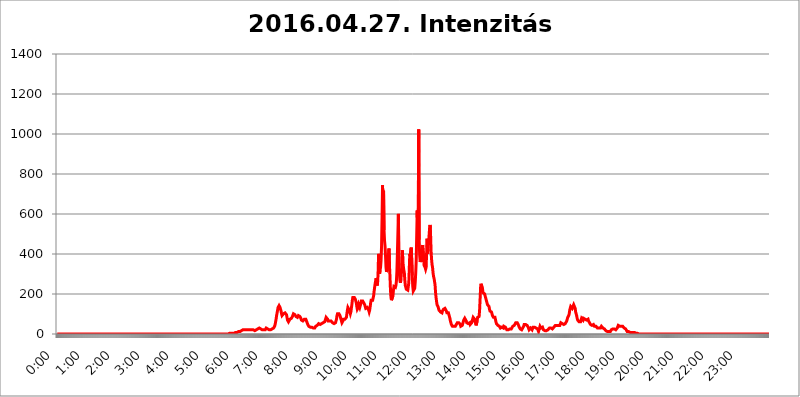
| Category | 2016.04.27. Intenzitás [W/m^2] |
|---|---|
| 0.0 | 0 |
| 0.0006944444444444445 | 0 |
| 0.001388888888888889 | 0 |
| 0.0020833333333333333 | 0 |
| 0.002777777777777778 | 0 |
| 0.003472222222222222 | 0 |
| 0.004166666666666667 | 0 |
| 0.004861111111111111 | 0 |
| 0.005555555555555556 | 0 |
| 0.0062499999999999995 | 0 |
| 0.006944444444444444 | 0 |
| 0.007638888888888889 | 0 |
| 0.008333333333333333 | 0 |
| 0.009027777777777779 | 0 |
| 0.009722222222222222 | 0 |
| 0.010416666666666666 | 0 |
| 0.011111111111111112 | 0 |
| 0.011805555555555555 | 0 |
| 0.012499999999999999 | 0 |
| 0.013194444444444444 | 0 |
| 0.013888888888888888 | 0 |
| 0.014583333333333332 | 0 |
| 0.015277777777777777 | 0 |
| 0.015972222222222224 | 0 |
| 0.016666666666666666 | 0 |
| 0.017361111111111112 | 0 |
| 0.018055555555555557 | 0 |
| 0.01875 | 0 |
| 0.019444444444444445 | 0 |
| 0.02013888888888889 | 0 |
| 0.020833333333333332 | 0 |
| 0.02152777777777778 | 0 |
| 0.022222222222222223 | 0 |
| 0.02291666666666667 | 0 |
| 0.02361111111111111 | 0 |
| 0.024305555555555556 | 0 |
| 0.024999999999999998 | 0 |
| 0.025694444444444447 | 0 |
| 0.02638888888888889 | 0 |
| 0.027083333333333334 | 0 |
| 0.027777777777777776 | 0 |
| 0.02847222222222222 | 0 |
| 0.029166666666666664 | 0 |
| 0.029861111111111113 | 0 |
| 0.030555555555555555 | 0 |
| 0.03125 | 0 |
| 0.03194444444444445 | 0 |
| 0.03263888888888889 | 0 |
| 0.03333333333333333 | 0 |
| 0.034027777777777775 | 0 |
| 0.034722222222222224 | 0 |
| 0.035416666666666666 | 0 |
| 0.036111111111111115 | 0 |
| 0.03680555555555556 | 0 |
| 0.0375 | 0 |
| 0.03819444444444444 | 0 |
| 0.03888888888888889 | 0 |
| 0.03958333333333333 | 0 |
| 0.04027777777777778 | 0 |
| 0.04097222222222222 | 0 |
| 0.041666666666666664 | 0 |
| 0.042361111111111106 | 0 |
| 0.04305555555555556 | 0 |
| 0.043750000000000004 | 0 |
| 0.044444444444444446 | 0 |
| 0.04513888888888889 | 0 |
| 0.04583333333333334 | 0 |
| 0.04652777777777778 | 0 |
| 0.04722222222222222 | 0 |
| 0.04791666666666666 | 0 |
| 0.04861111111111111 | 0 |
| 0.049305555555555554 | 0 |
| 0.049999999999999996 | 0 |
| 0.05069444444444445 | 0 |
| 0.051388888888888894 | 0 |
| 0.052083333333333336 | 0 |
| 0.05277777777777778 | 0 |
| 0.05347222222222222 | 0 |
| 0.05416666666666667 | 0 |
| 0.05486111111111111 | 0 |
| 0.05555555555555555 | 0 |
| 0.05625 | 0 |
| 0.05694444444444444 | 0 |
| 0.057638888888888885 | 0 |
| 0.05833333333333333 | 0 |
| 0.05902777777777778 | 0 |
| 0.059722222222222225 | 0 |
| 0.06041666666666667 | 0 |
| 0.061111111111111116 | 0 |
| 0.06180555555555556 | 0 |
| 0.0625 | 0 |
| 0.06319444444444444 | 0 |
| 0.06388888888888888 | 0 |
| 0.06458333333333334 | 0 |
| 0.06527777777777778 | 0 |
| 0.06597222222222222 | 0 |
| 0.06666666666666667 | 0 |
| 0.06736111111111111 | 0 |
| 0.06805555555555555 | 0 |
| 0.06874999999999999 | 0 |
| 0.06944444444444443 | 0 |
| 0.07013888888888889 | 0 |
| 0.07083333333333333 | 0 |
| 0.07152777777777779 | 0 |
| 0.07222222222222223 | 0 |
| 0.07291666666666667 | 0 |
| 0.07361111111111111 | 0 |
| 0.07430555555555556 | 0 |
| 0.075 | 0 |
| 0.07569444444444444 | 0 |
| 0.0763888888888889 | 0 |
| 0.07708333333333334 | 0 |
| 0.07777777777777778 | 0 |
| 0.07847222222222222 | 0 |
| 0.07916666666666666 | 0 |
| 0.0798611111111111 | 0 |
| 0.08055555555555556 | 0 |
| 0.08125 | 0 |
| 0.08194444444444444 | 0 |
| 0.08263888888888889 | 0 |
| 0.08333333333333333 | 0 |
| 0.08402777777777777 | 0 |
| 0.08472222222222221 | 0 |
| 0.08541666666666665 | 0 |
| 0.08611111111111112 | 0 |
| 0.08680555555555557 | 0 |
| 0.08750000000000001 | 0 |
| 0.08819444444444445 | 0 |
| 0.08888888888888889 | 0 |
| 0.08958333333333333 | 0 |
| 0.09027777777777778 | 0 |
| 0.09097222222222222 | 0 |
| 0.09166666666666667 | 0 |
| 0.09236111111111112 | 0 |
| 0.09305555555555556 | 0 |
| 0.09375 | 0 |
| 0.09444444444444444 | 0 |
| 0.09513888888888888 | 0 |
| 0.09583333333333333 | 0 |
| 0.09652777777777777 | 0 |
| 0.09722222222222222 | 0 |
| 0.09791666666666667 | 0 |
| 0.09861111111111111 | 0 |
| 0.09930555555555555 | 0 |
| 0.09999999999999999 | 0 |
| 0.10069444444444443 | 0 |
| 0.1013888888888889 | 0 |
| 0.10208333333333335 | 0 |
| 0.10277777777777779 | 0 |
| 0.10347222222222223 | 0 |
| 0.10416666666666667 | 0 |
| 0.10486111111111111 | 0 |
| 0.10555555555555556 | 0 |
| 0.10625 | 0 |
| 0.10694444444444444 | 0 |
| 0.1076388888888889 | 0 |
| 0.10833333333333334 | 0 |
| 0.10902777777777778 | 0 |
| 0.10972222222222222 | 0 |
| 0.1111111111111111 | 0 |
| 0.11180555555555556 | 0 |
| 0.11180555555555556 | 0 |
| 0.1125 | 0 |
| 0.11319444444444444 | 0 |
| 0.11388888888888889 | 0 |
| 0.11458333333333333 | 0 |
| 0.11527777777777777 | 0 |
| 0.11597222222222221 | 0 |
| 0.11666666666666665 | 0 |
| 0.1173611111111111 | 0 |
| 0.11805555555555557 | 0 |
| 0.11944444444444445 | 0 |
| 0.12013888888888889 | 0 |
| 0.12083333333333333 | 0 |
| 0.12152777777777778 | 0 |
| 0.12222222222222223 | 0 |
| 0.12291666666666667 | 0 |
| 0.12291666666666667 | 0 |
| 0.12361111111111112 | 0 |
| 0.12430555555555556 | 0 |
| 0.125 | 0 |
| 0.12569444444444444 | 0 |
| 0.12638888888888888 | 0 |
| 0.12708333333333333 | 0 |
| 0.16875 | 0 |
| 0.12847222222222224 | 0 |
| 0.12916666666666668 | 0 |
| 0.12986111111111112 | 0 |
| 0.13055555555555556 | 0 |
| 0.13125 | 0 |
| 0.13194444444444445 | 0 |
| 0.1326388888888889 | 0 |
| 0.13333333333333333 | 0 |
| 0.13402777777777777 | 0 |
| 0.13402777777777777 | 0 |
| 0.13472222222222222 | 0 |
| 0.13541666666666666 | 0 |
| 0.1361111111111111 | 0 |
| 0.13749999999999998 | 0 |
| 0.13819444444444443 | 0 |
| 0.1388888888888889 | 0 |
| 0.13958333333333334 | 0 |
| 0.14027777777777778 | 0 |
| 0.14097222222222222 | 0 |
| 0.14166666666666666 | 0 |
| 0.1423611111111111 | 0 |
| 0.14305555555555557 | 0 |
| 0.14375000000000002 | 0 |
| 0.14444444444444446 | 0 |
| 0.1451388888888889 | 0 |
| 0.1451388888888889 | 0 |
| 0.14652777777777778 | 0 |
| 0.14722222222222223 | 0 |
| 0.14791666666666667 | 0 |
| 0.1486111111111111 | 0 |
| 0.14930555555555555 | 0 |
| 0.15 | 0 |
| 0.15069444444444444 | 0 |
| 0.15138888888888888 | 0 |
| 0.15208333333333332 | 0 |
| 0.15277777777777776 | 0 |
| 0.15347222222222223 | 0 |
| 0.15416666666666667 | 0 |
| 0.15486111111111112 | 0 |
| 0.15555555555555556 | 0 |
| 0.15625 | 0 |
| 0.15694444444444444 | 0 |
| 0.15763888888888888 | 0 |
| 0.15833333333333333 | 0 |
| 0.15902777777777777 | 0 |
| 0.15972222222222224 | 0 |
| 0.16041666666666668 | 0 |
| 0.16111111111111112 | 0 |
| 0.16180555555555556 | 0 |
| 0.1625 | 0 |
| 0.16319444444444445 | 0 |
| 0.1638888888888889 | 0 |
| 0.16458333333333333 | 0 |
| 0.16527777777777777 | 0 |
| 0.16597222222222222 | 0 |
| 0.16666666666666666 | 0 |
| 0.1673611111111111 | 0 |
| 0.16805555555555554 | 0 |
| 0.16874999999999998 | 0 |
| 0.16944444444444443 | 0 |
| 0.17013888888888887 | 0 |
| 0.1708333333333333 | 0 |
| 0.17152777777777775 | 0 |
| 0.17222222222222225 | 0 |
| 0.1729166666666667 | 0 |
| 0.17361111111111113 | 0 |
| 0.17430555555555557 | 0 |
| 0.17500000000000002 | 0 |
| 0.17569444444444446 | 0 |
| 0.1763888888888889 | 0 |
| 0.17708333333333334 | 0 |
| 0.17777777777777778 | 0 |
| 0.17847222222222223 | 0 |
| 0.17916666666666667 | 0 |
| 0.1798611111111111 | 0 |
| 0.18055555555555555 | 0 |
| 0.18125 | 0 |
| 0.18194444444444444 | 0 |
| 0.1826388888888889 | 0 |
| 0.18333333333333335 | 0 |
| 0.1840277777777778 | 0 |
| 0.18472222222222223 | 0 |
| 0.18541666666666667 | 0 |
| 0.18611111111111112 | 0 |
| 0.18680555555555556 | 0 |
| 0.1875 | 0 |
| 0.18819444444444444 | 0 |
| 0.18888888888888888 | 0 |
| 0.18958333333333333 | 0 |
| 0.19027777777777777 | 0 |
| 0.1909722222222222 | 0 |
| 0.19166666666666665 | 0 |
| 0.19236111111111112 | 0 |
| 0.19305555555555554 | 0 |
| 0.19375 | 0 |
| 0.19444444444444445 | 0 |
| 0.1951388888888889 | 0 |
| 0.19583333333333333 | 0 |
| 0.19652777777777777 | 0 |
| 0.19722222222222222 | 0 |
| 0.19791666666666666 | 0 |
| 0.1986111111111111 | 0 |
| 0.19930555555555554 | 0 |
| 0.19999999999999998 | 0 |
| 0.20069444444444443 | 0 |
| 0.20138888888888887 | 0 |
| 0.2020833333333333 | 0 |
| 0.2027777777777778 | 0 |
| 0.2034722222222222 | 0 |
| 0.2041666666666667 | 0 |
| 0.20486111111111113 | 0 |
| 0.20555555555555557 | 0 |
| 0.20625000000000002 | 0 |
| 0.20694444444444446 | 0 |
| 0.2076388888888889 | 0 |
| 0.20833333333333334 | 0 |
| 0.20902777777777778 | 0 |
| 0.20972222222222223 | 0 |
| 0.21041666666666667 | 0 |
| 0.2111111111111111 | 0 |
| 0.21180555555555555 | 0 |
| 0.2125 | 0 |
| 0.21319444444444444 | 0 |
| 0.2138888888888889 | 0 |
| 0.21458333333333335 | 0 |
| 0.2152777777777778 | 0 |
| 0.21597222222222223 | 0 |
| 0.21666666666666667 | 0 |
| 0.21736111111111112 | 0 |
| 0.21805555555555556 | 0 |
| 0.21875 | 0 |
| 0.21944444444444444 | 0 |
| 0.22013888888888888 | 0 |
| 0.22083333333333333 | 0 |
| 0.22152777777777777 | 0 |
| 0.2222222222222222 | 0 |
| 0.22291666666666665 | 0 |
| 0.2236111111111111 | 0 |
| 0.22430555555555556 | 0 |
| 0.225 | 0 |
| 0.22569444444444445 | 0 |
| 0.2263888888888889 | 0 |
| 0.22708333333333333 | 0 |
| 0.22777777777777777 | 0 |
| 0.22847222222222222 | 0 |
| 0.22916666666666666 | 0 |
| 0.2298611111111111 | 0 |
| 0.23055555555555554 | 0 |
| 0.23124999999999998 | 0 |
| 0.23194444444444443 | 0 |
| 0.23263888888888887 | 0 |
| 0.2333333333333333 | 0 |
| 0.2340277777777778 | 0 |
| 0.2347222222222222 | 0 |
| 0.2354166666666667 | 0 |
| 0.23611111111111113 | 0 |
| 0.23680555555555557 | 0 |
| 0.23750000000000002 | 0 |
| 0.23819444444444446 | 0 |
| 0.2388888888888889 | 0 |
| 0.23958333333333334 | 0 |
| 0.24027777777777778 | 0 |
| 0.24097222222222223 | 0 |
| 0.24166666666666667 | 3.525 |
| 0.2423611111111111 | 3.525 |
| 0.24305555555555555 | 3.525 |
| 0.24375 | 3.525 |
| 0.24444444444444446 | 3.525 |
| 0.24513888888888888 | 3.525 |
| 0.24583333333333335 | 3.525 |
| 0.2465277777777778 | 3.525 |
| 0.24722222222222223 | 3.525 |
| 0.24791666666666667 | 3.525 |
| 0.24861111111111112 | 3.525 |
| 0.24930555555555556 | 7.887 |
| 0.25 | 7.887 |
| 0.25069444444444444 | 7.887 |
| 0.2513888888888889 | 7.887 |
| 0.2520833333333333 | 7.887 |
| 0.25277777777777777 | 7.887 |
| 0.2534722222222222 | 7.887 |
| 0.25416666666666665 | 12.257 |
| 0.2548611111111111 | 12.257 |
| 0.2555555555555556 | 12.257 |
| 0.25625000000000003 | 12.257 |
| 0.2569444444444445 | 12.257 |
| 0.2576388888888889 | 16.636 |
| 0.25833333333333336 | 16.636 |
| 0.2590277777777778 | 16.636 |
| 0.25972222222222224 | 21.024 |
| 0.2604166666666667 | 21.024 |
| 0.2611111111111111 | 21.024 |
| 0.26180555555555557 | 21.024 |
| 0.2625 | 21.024 |
| 0.26319444444444445 | 25.419 |
| 0.2638888888888889 | 21.024 |
| 0.26458333333333334 | 21.024 |
| 0.2652777777777778 | 21.024 |
| 0.2659722222222222 | 21.024 |
| 0.26666666666666666 | 21.024 |
| 0.2673611111111111 | 21.024 |
| 0.26805555555555555 | 21.024 |
| 0.26875 | 21.024 |
| 0.26944444444444443 | 21.024 |
| 0.2701388888888889 | 21.024 |
| 0.2708333333333333 | 21.024 |
| 0.27152777777777776 | 21.024 |
| 0.2722222222222222 | 21.024 |
| 0.27291666666666664 | 21.024 |
| 0.2736111111111111 | 21.024 |
| 0.2743055555555555 | 21.024 |
| 0.27499999999999997 | 21.024 |
| 0.27569444444444446 | 21.024 |
| 0.27638888888888885 | 21.024 |
| 0.27708333333333335 | 16.636 |
| 0.2777777777777778 | 21.024 |
| 0.27847222222222223 | 21.024 |
| 0.2791666666666667 | 21.024 |
| 0.2798611111111111 | 25.419 |
| 0.28055555555555556 | 25.419 |
| 0.28125 | 25.419 |
| 0.28194444444444444 | 29.823 |
| 0.2826388888888889 | 29.823 |
| 0.2833333333333333 | 29.823 |
| 0.28402777777777777 | 25.419 |
| 0.2847222222222222 | 25.419 |
| 0.28541666666666665 | 25.419 |
| 0.28611111111111115 | 25.419 |
| 0.28680555555555554 | 25.419 |
| 0.28750000000000003 | 21.024 |
| 0.2881944444444445 | 21.024 |
| 0.2888888888888889 | 21.024 |
| 0.28958333333333336 | 21.024 |
| 0.2902777777777778 | 21.024 |
| 0.29097222222222224 | 21.024 |
| 0.2916666666666667 | 21.024 |
| 0.2923611111111111 | 25.419 |
| 0.29305555555555557 | 29.823 |
| 0.29375 | 29.823 |
| 0.29444444444444445 | 25.419 |
| 0.2951388888888889 | 25.419 |
| 0.29583333333333334 | 25.419 |
| 0.2965277777777778 | 21.024 |
| 0.2972222222222222 | 21.024 |
| 0.29791666666666666 | 21.024 |
| 0.2986111111111111 | 21.024 |
| 0.29930555555555555 | 21.024 |
| 0.3 | 25.419 |
| 0.30069444444444443 | 25.419 |
| 0.3013888888888889 | 25.419 |
| 0.3020833333333333 | 25.419 |
| 0.30277777777777776 | 25.419 |
| 0.3034722222222222 | 29.823 |
| 0.30416666666666664 | 34.234 |
| 0.3048611111111111 | 38.653 |
| 0.3055555555555555 | 47.511 |
| 0.30624999999999997 | 60.85 |
| 0.3069444444444444 | 74.246 |
| 0.3076388888888889 | 92.184 |
| 0.30833333333333335 | 105.69 |
| 0.3090277777777778 | 119.235 |
| 0.30972222222222223 | 132.814 |
| 0.3104166666666667 | 137.347 |
| 0.3111111111111111 | 141.884 |
| 0.31180555555555556 | 137.347 |
| 0.3125 | 132.814 |
| 0.31319444444444444 | 123.758 |
| 0.3138888888888889 | 114.716 |
| 0.3145833333333333 | 101.184 |
| 0.31527777777777777 | 92.184 |
| 0.3159722222222222 | 92.184 |
| 0.31666666666666665 | 96.682 |
| 0.31736111111111115 | 101.184 |
| 0.31805555555555554 | 101.184 |
| 0.31875000000000003 | 101.184 |
| 0.3194444444444445 | 105.69 |
| 0.3201388888888889 | 110.201 |
| 0.32083333333333336 | 105.69 |
| 0.3215277777777778 | 96.682 |
| 0.32222222222222224 | 83.205 |
| 0.3229166666666667 | 69.775 |
| 0.3236111111111111 | 65.31 |
| 0.32430555555555557 | 60.85 |
| 0.325 | 60.85 |
| 0.32569444444444445 | 65.31 |
| 0.3263888888888889 | 74.246 |
| 0.32708333333333334 | 74.246 |
| 0.3277777777777778 | 78.722 |
| 0.3284722222222222 | 78.722 |
| 0.32916666666666666 | 83.205 |
| 0.3298611111111111 | 87.692 |
| 0.33055555555555555 | 92.184 |
| 0.33125 | 101.184 |
| 0.33194444444444443 | 105.69 |
| 0.3326388888888889 | 101.184 |
| 0.3333333333333333 | 96.682 |
| 0.3340277777777778 | 92.184 |
| 0.3347222222222222 | 87.692 |
| 0.3354166666666667 | 83.205 |
| 0.3361111111111111 | 83.205 |
| 0.3368055555555556 | 83.205 |
| 0.33749999999999997 | 87.692 |
| 0.33819444444444446 | 92.184 |
| 0.33888888888888885 | 92.184 |
| 0.33958333333333335 | 92.184 |
| 0.34027777777777773 | 87.692 |
| 0.34097222222222223 | 83.205 |
| 0.3416666666666666 | 78.722 |
| 0.3423611111111111 | 69.775 |
| 0.3430555555555555 | 65.31 |
| 0.34375 | 65.31 |
| 0.3444444444444445 | 65.31 |
| 0.3451388888888889 | 69.775 |
| 0.3458333333333334 | 69.775 |
| 0.34652777777777777 | 74.246 |
| 0.34722222222222227 | 74.246 |
| 0.34791666666666665 | 78.722 |
| 0.34861111111111115 | 74.246 |
| 0.34930555555555554 | 69.775 |
| 0.35000000000000003 | 60.85 |
| 0.3506944444444444 | 56.398 |
| 0.3513888888888889 | 47.511 |
| 0.3520833333333333 | 43.079 |
| 0.3527777777777778 | 38.653 |
| 0.3534722222222222 | 34.234 |
| 0.3541666666666667 | 34.234 |
| 0.3548611111111111 | 34.234 |
| 0.35555555555555557 | 34.234 |
| 0.35625 | 34.234 |
| 0.35694444444444445 | 34.234 |
| 0.3576388888888889 | 29.823 |
| 0.35833333333333334 | 29.823 |
| 0.3590277777777778 | 29.823 |
| 0.3597222222222222 | 29.823 |
| 0.36041666666666666 | 29.823 |
| 0.3611111111111111 | 29.823 |
| 0.36180555555555555 | 34.234 |
| 0.3625 | 38.653 |
| 0.36319444444444443 | 38.653 |
| 0.3638888888888889 | 43.079 |
| 0.3645833333333333 | 43.079 |
| 0.3652777777777778 | 43.079 |
| 0.3659722222222222 | 47.511 |
| 0.3666666666666667 | 51.951 |
| 0.3673611111111111 | 51.951 |
| 0.3680555555555556 | 47.511 |
| 0.36874999999999997 | 47.511 |
| 0.36944444444444446 | 47.511 |
| 0.37013888888888885 | 51.951 |
| 0.37083333333333335 | 51.951 |
| 0.37152777777777773 | 51.951 |
| 0.37222222222222223 | 51.951 |
| 0.3729166666666666 | 56.398 |
| 0.3736111111111111 | 56.398 |
| 0.3743055555555555 | 60.85 |
| 0.375 | 60.85 |
| 0.3756944444444445 | 65.31 |
| 0.3763888888888889 | 74.246 |
| 0.3770833333333334 | 83.205 |
| 0.37777777777777777 | 83.205 |
| 0.37847222222222227 | 78.722 |
| 0.37916666666666665 | 74.246 |
| 0.37986111111111115 | 65.31 |
| 0.38055555555555554 | 65.31 |
| 0.38125000000000003 | 65.31 |
| 0.3819444444444444 | 65.31 |
| 0.3826388888888889 | 65.31 |
| 0.3833333333333333 | 69.775 |
| 0.3840277777777778 | 65.31 |
| 0.3847222222222222 | 65.31 |
| 0.3854166666666667 | 60.85 |
| 0.3861111111111111 | 56.398 |
| 0.38680555555555557 | 51.951 |
| 0.3875 | 51.951 |
| 0.38819444444444445 | 51.951 |
| 0.3888888888888889 | 51.951 |
| 0.38958333333333334 | 56.398 |
| 0.3902777777777778 | 56.398 |
| 0.3909722222222222 | 60.85 |
| 0.39166666666666666 | 74.246 |
| 0.3923611111111111 | 92.184 |
| 0.39305555555555555 | 101.184 |
| 0.39375 | 105.69 |
| 0.39444444444444443 | 101.184 |
| 0.3951388888888889 | 101.184 |
| 0.3958333333333333 | 101.184 |
| 0.3965277777777778 | 92.184 |
| 0.3972222222222222 | 83.205 |
| 0.3979166666666667 | 78.722 |
| 0.3986111111111111 | 65.31 |
| 0.3993055555555556 | 56.398 |
| 0.39999999999999997 | 56.398 |
| 0.40069444444444446 | 65.31 |
| 0.40138888888888885 | 74.246 |
| 0.40208333333333335 | 74.246 |
| 0.40277777777777773 | 74.246 |
| 0.40347222222222223 | 74.246 |
| 0.4041666666666666 | 74.246 |
| 0.4048611111111111 | 74.246 |
| 0.4055555555555555 | 83.205 |
| 0.40625 | 101.184 |
| 0.4069444444444445 | 119.235 |
| 0.4076388888888889 | 132.814 |
| 0.4083333333333334 | 137.347 |
| 0.40902777777777777 | 128.284 |
| 0.40972222222222227 | 119.235 |
| 0.41041666666666665 | 110.201 |
| 0.41111111111111115 | 101.184 |
| 0.41180555555555554 | 110.201 |
| 0.41250000000000003 | 128.284 |
| 0.4131944444444444 | 146.423 |
| 0.4138888888888889 | 169.156 |
| 0.4145833333333333 | 182.82 |
| 0.4152777777777778 | 187.378 |
| 0.4159722222222222 | 187.378 |
| 0.4166666666666667 | 182.82 |
| 0.4173611111111111 | 178.264 |
| 0.41805555555555557 | 173.709 |
| 0.41875 | 173.709 |
| 0.41944444444444445 | 155.509 |
| 0.4201388888888889 | 137.347 |
| 0.42083333333333334 | 123.758 |
| 0.4215277777777778 | 123.758 |
| 0.4222222222222222 | 132.814 |
| 0.42291666666666666 | 146.423 |
| 0.4236111111111111 | 141.884 |
| 0.42430555555555555 | 132.814 |
| 0.425 | 137.347 |
| 0.42569444444444443 | 150.964 |
| 0.4263888888888889 | 164.605 |
| 0.4270833333333333 | 164.605 |
| 0.4277777777777778 | 169.156 |
| 0.4284722222222222 | 164.605 |
| 0.4291666666666667 | 160.056 |
| 0.4298611111111111 | 155.509 |
| 0.4305555555555556 | 150.964 |
| 0.43124999999999997 | 146.423 |
| 0.43194444444444446 | 137.347 |
| 0.43263888888888885 | 128.284 |
| 0.43333333333333335 | 123.758 |
| 0.43402777777777773 | 123.758 |
| 0.43472222222222223 | 132.814 |
| 0.4354166666666666 | 137.347 |
| 0.4361111111111111 | 128.284 |
| 0.4368055555555555 | 119.235 |
| 0.4375 | 110.201 |
| 0.4381944444444445 | 119.235 |
| 0.4388888888888889 | 137.347 |
| 0.4395833333333334 | 155.509 |
| 0.44027777777777777 | 169.156 |
| 0.44097222222222227 | 169.156 |
| 0.44166666666666665 | 164.605 |
| 0.44236111111111115 | 169.156 |
| 0.44305555555555554 | 173.709 |
| 0.44375000000000003 | 191.937 |
| 0.4444444444444444 | 214.746 |
| 0.4451388888888889 | 233 |
| 0.4458333333333333 | 251.251 |
| 0.4465277777777778 | 264.932 |
| 0.4472222222222222 | 278.603 |
| 0.4479166666666667 | 264.932 |
| 0.4486111111111111 | 242.127 |
| 0.44930555555555557 | 255.813 |
| 0.45 | 305.898 |
| 0.45069444444444445 | 400.638 |
| 0.4513888888888889 | 333.113 |
| 0.45208333333333334 | 301.354 |
| 0.4527777777777778 | 319.517 |
| 0.4534722222222222 | 333.113 |
| 0.45416666666666666 | 369.23 |
| 0.4548611111111111 | 440.702 |
| 0.45555555555555555 | 583.779 |
| 0.45625 | 743.859 |
| 0.45694444444444443 | 634.105 |
| 0.4576388888888889 | 715.858 |
| 0.4583333333333333 | 519.555 |
| 0.4590277777777778 | 467.187 |
| 0.4597222222222222 | 440.702 |
| 0.4604166666666667 | 391.685 |
| 0.4611111111111111 | 333.113 |
| 0.4618055555555556 | 310.44 |
| 0.46249999999999997 | 310.44 |
| 0.46319444444444446 | 324.052 |
| 0.46388888888888885 | 360.221 |
| 0.46458333333333335 | 396.164 |
| 0.46527777777777773 | 427.39 |
| 0.46597222222222223 | 342.162 |
| 0.4666666666666666 | 287.709 |
| 0.4673611111111111 | 219.309 |
| 0.4680555555555555 | 182.82 |
| 0.46875 | 169.156 |
| 0.4694444444444445 | 164.605 |
| 0.4701388888888889 | 173.709 |
| 0.4708333333333334 | 191.937 |
| 0.47152777777777777 | 219.309 |
| 0.47222222222222227 | 237.564 |
| 0.47291666666666665 | 242.127 |
| 0.47361111111111115 | 233 |
| 0.47430555555555554 | 233 |
| 0.47500000000000003 | 242.127 |
| 0.4756944444444444 | 264.932 |
| 0.4763888888888889 | 314.98 |
| 0.4770833333333333 | 405.108 |
| 0.4777777777777778 | 409.574 |
| 0.4784722222222222 | 600.661 |
| 0.4791666666666667 | 342.162 |
| 0.4798611111111111 | 301.354 |
| 0.48055555555555557 | 269.49 |
| 0.48125 | 255.813 |
| 0.48194444444444445 | 269.49 |
| 0.4826388888888889 | 301.354 |
| 0.48333333333333334 | 351.198 |
| 0.4840277777777778 | 418.492 |
| 0.4847222222222222 | 364.728 |
| 0.48541666666666666 | 337.639 |
| 0.4861111111111111 | 319.517 |
| 0.48680555555555555 | 305.898 |
| 0.4875 | 269.49 |
| 0.48819444444444443 | 242.127 |
| 0.4888888888888889 | 233 |
| 0.4895833333333333 | 223.873 |
| 0.4902777777777778 | 223.873 |
| 0.4909722222222222 | 219.309 |
| 0.4916666666666667 | 219.309 |
| 0.4923611111111111 | 223.873 |
| 0.4930555555555556 | 255.813 |
| 0.49374999999999997 | 328.584 |
| 0.49444444444444446 | 400.638 |
| 0.49513888888888885 | 391.685 |
| 0.49583333333333335 | 396.164 |
| 0.49652777777777773 | 431.833 |
| 0.49722222222222223 | 431.833 |
| 0.4979166666666666 | 292.259 |
| 0.4986111111111111 | 237.564 |
| 0.4993055555555555 | 214.746 |
| 0.5 | 210.182 |
| 0.5006944444444444 | 210.182 |
| 0.5013888888888889 | 228.436 |
| 0.5020833333333333 | 260.373 |
| 0.5027777777777778 | 305.898 |
| 0.5034722222222222 | 369.23 |
| 0.5041666666666667 | 493.475 |
| 0.5048611111111111 | 617.436 |
| 0.5055555555555555 | 515.223 |
| 0.50625 | 458.38 |
| 0.5069444444444444 | 1022.323 |
| 0.5076388888888889 | 471.582 |
| 0.5083333333333333 | 391.685 |
| 0.5090277777777777 | 360.221 |
| 0.5097222222222222 | 369.23 |
| 0.5104166666666666 | 360.221 |
| 0.5111111111111112 | 387.202 |
| 0.5118055555555555 | 422.943 |
| 0.5125000000000001 | 445.129 |
| 0.5131944444444444 | 440.702 |
| 0.513888888888889 | 378.224 |
| 0.5145833333333333 | 342.162 |
| 0.5152777777777778 | 337.639 |
| 0.5159722222222222 | 333.113 |
| 0.5166666666666667 | 324.052 |
| 0.517361111111111 | 333.113 |
| 0.5180555555555556 | 405.108 |
| 0.5187499999999999 | 475.972 |
| 0.5194444444444445 | 400.638 |
| 0.5201388888888888 | 427.39 |
| 0.5208333333333334 | 458.38 |
| 0.5215277777777778 | 493.475 |
| 0.5222222222222223 | 528.2 |
| 0.5229166666666667 | 545.416 |
| 0.5236111111111111 | 497.836 |
| 0.5243055555555556 | 414.035 |
| 0.525 | 373.729 |
| 0.5256944444444445 | 346.682 |
| 0.5263888888888889 | 333.113 |
| 0.5270833333333333 | 305.898 |
| 0.5277777777777778 | 287.709 |
| 0.5284722222222222 | 278.603 |
| 0.5291666666666667 | 274.047 |
| 0.5298611111111111 | 246.689 |
| 0.5305555555555556 | 210.182 |
| 0.53125 | 182.82 |
| 0.5319444444444444 | 164.605 |
| 0.5326388888888889 | 146.423 |
| 0.5333333333333333 | 141.884 |
| 0.5340277777777778 | 137.347 |
| 0.5347222222222222 | 128.284 |
| 0.5354166666666667 | 119.235 |
| 0.5361111111111111 | 119.235 |
| 0.5368055555555555 | 114.716 |
| 0.5375 | 110.201 |
| 0.5381944444444444 | 105.69 |
| 0.5388888888888889 | 105.69 |
| 0.5395833333333333 | 105.69 |
| 0.5402777777777777 | 114.716 |
| 0.5409722222222222 | 119.235 |
| 0.5416666666666666 | 123.758 |
| 0.5423611111111112 | 123.758 |
| 0.5430555555555555 | 123.758 |
| 0.5437500000000001 | 128.284 |
| 0.5444444444444444 | 132.814 |
| 0.545138888888889 | 128.284 |
| 0.5458333333333333 | 114.716 |
| 0.5465277777777778 | 105.69 |
| 0.5472222222222222 | 101.184 |
| 0.5479166666666667 | 105.69 |
| 0.548611111111111 | 105.69 |
| 0.5493055555555556 | 101.184 |
| 0.5499999999999999 | 87.692 |
| 0.5506944444444445 | 78.722 |
| 0.5513888888888888 | 65.31 |
| 0.5520833333333334 | 56.398 |
| 0.5527777777777778 | 47.511 |
| 0.5534722222222223 | 43.079 |
| 0.5541666666666667 | 38.653 |
| 0.5548611111111111 | 38.653 |
| 0.5555555555555556 | 38.653 |
| 0.55625 | 38.653 |
| 0.5569444444444445 | 38.653 |
| 0.5576388888888889 | 38.653 |
| 0.5583333333333333 | 38.653 |
| 0.5590277777777778 | 43.079 |
| 0.5597222222222222 | 47.511 |
| 0.5604166666666667 | 51.951 |
| 0.5611111111111111 | 56.398 |
| 0.5618055555555556 | 56.398 |
| 0.5625 | 56.398 |
| 0.5631944444444444 | 56.398 |
| 0.5638888888888889 | 56.398 |
| 0.5645833333333333 | 56.398 |
| 0.5652777777777778 | 47.511 |
| 0.5659722222222222 | 38.653 |
| 0.5666666666666667 | 38.653 |
| 0.5673611111111111 | 38.653 |
| 0.5680555555555555 | 43.079 |
| 0.56875 | 47.511 |
| 0.5694444444444444 | 60.85 |
| 0.5701388888888889 | 69.775 |
| 0.5708333333333333 | 69.775 |
| 0.5715277777777777 | 78.722 |
| 0.5722222222222222 | 78.722 |
| 0.5729166666666666 | 74.246 |
| 0.5736111111111112 | 65.31 |
| 0.5743055555555555 | 56.398 |
| 0.5750000000000001 | 51.951 |
| 0.5756944444444444 | 51.951 |
| 0.576388888888889 | 51.951 |
| 0.5770833333333333 | 51.951 |
| 0.5777777777777778 | 51.951 |
| 0.5784722222222222 | 56.398 |
| 0.5791666666666667 | 47.511 |
| 0.579861111111111 | 43.079 |
| 0.5805555555555556 | 51.951 |
| 0.5812499999999999 | 56.398 |
| 0.5819444444444445 | 65.31 |
| 0.5826388888888888 | 69.775 |
| 0.5833333333333334 | 83.205 |
| 0.5840277777777778 | 87.692 |
| 0.5847222222222223 | 83.205 |
| 0.5854166666666667 | 74.246 |
| 0.5861111111111111 | 60.85 |
| 0.5868055555555556 | 51.951 |
| 0.5875 | 43.079 |
| 0.5881944444444445 | 47.511 |
| 0.5888888888888889 | 65.31 |
| 0.5895833333333333 | 83.205 |
| 0.5902777777777778 | 87.692 |
| 0.5909722222222222 | 83.205 |
| 0.5916666666666667 | 87.692 |
| 0.5923611111111111 | 119.235 |
| 0.5930555555555556 | 173.709 |
| 0.59375 | 233 |
| 0.5944444444444444 | 251.251 |
| 0.5951388888888889 | 251.251 |
| 0.5958333333333333 | 246.689 |
| 0.5965277777777778 | 223.873 |
| 0.5972222222222222 | 205.62 |
| 0.5979166666666667 | 205.62 |
| 0.5986111111111111 | 210.182 |
| 0.5993055555555555 | 201.058 |
| 0.6 | 191.937 |
| 0.6006944444444444 | 182.82 |
| 0.6013888888888889 | 173.709 |
| 0.6020833333333333 | 164.605 |
| 0.6027777777777777 | 155.509 |
| 0.6034722222222222 | 146.423 |
| 0.6041666666666666 | 141.884 |
| 0.6048611111111112 | 141.884 |
| 0.6055555555555555 | 137.347 |
| 0.6062500000000001 | 123.758 |
| 0.6069444444444444 | 114.716 |
| 0.607638888888889 | 114.716 |
| 0.6083333333333333 | 114.716 |
| 0.6090277777777778 | 110.201 |
| 0.6097222222222222 | 101.184 |
| 0.6104166666666667 | 92.184 |
| 0.611111111111111 | 87.692 |
| 0.6118055555555556 | 83.205 |
| 0.6124999999999999 | 83.205 |
| 0.6131944444444445 | 83.205 |
| 0.6138888888888888 | 83.205 |
| 0.6145833333333334 | 78.722 |
| 0.6152777777777778 | 60.85 |
| 0.6159722222222223 | 51.951 |
| 0.6166666666666667 | 47.511 |
| 0.6173611111111111 | 47.511 |
| 0.6180555555555556 | 43.079 |
| 0.61875 | 43.079 |
| 0.6194444444444445 | 38.653 |
| 0.6201388888888889 | 38.653 |
| 0.6208333333333333 | 34.234 |
| 0.6215277777777778 | 29.823 |
| 0.6222222222222222 | 29.823 |
| 0.6229166666666667 | 29.823 |
| 0.6236111111111111 | 34.234 |
| 0.6243055555555556 | 34.234 |
| 0.625 | 29.823 |
| 0.6256944444444444 | 29.823 |
| 0.6263888888888889 | 38.653 |
| 0.6270833333333333 | 38.653 |
| 0.6277777777777778 | 38.653 |
| 0.6284722222222222 | 34.234 |
| 0.6291666666666667 | 34.234 |
| 0.6298611111111111 | 29.823 |
| 0.6305555555555555 | 21.024 |
| 0.63125 | 21.024 |
| 0.6319444444444444 | 21.024 |
| 0.6326388888888889 | 21.024 |
| 0.6333333333333333 | 25.419 |
| 0.6340277777777777 | 25.419 |
| 0.6347222222222222 | 25.419 |
| 0.6354166666666666 | 25.419 |
| 0.6361111111111112 | 25.419 |
| 0.6368055555555555 | 25.419 |
| 0.6375000000000001 | 29.823 |
| 0.6381944444444444 | 29.823 |
| 0.638888888888889 | 38.653 |
| 0.6395833333333333 | 43.079 |
| 0.6402777777777778 | 43.079 |
| 0.6409722222222222 | 43.079 |
| 0.6416666666666667 | 47.511 |
| 0.642361111111111 | 47.511 |
| 0.6430555555555556 | 56.398 |
| 0.6437499999999999 | 56.398 |
| 0.6444444444444445 | 56.398 |
| 0.6451388888888888 | 56.398 |
| 0.6458333333333334 | 51.951 |
| 0.6465277777777778 | 47.511 |
| 0.6472222222222223 | 43.079 |
| 0.6479166666666667 | 34.234 |
| 0.6486111111111111 | 29.823 |
| 0.6493055555555556 | 25.419 |
| 0.65 | 21.024 |
| 0.6506944444444445 | 21.024 |
| 0.6513888888888889 | 21.024 |
| 0.6520833333333333 | 25.419 |
| 0.6527777777777778 | 29.823 |
| 0.6534722222222222 | 34.234 |
| 0.6541666666666667 | 38.653 |
| 0.6548611111111111 | 47.511 |
| 0.6555555555555556 | 47.511 |
| 0.65625 | 47.511 |
| 0.6569444444444444 | 47.511 |
| 0.6576388888888889 | 47.511 |
| 0.6583333333333333 | 43.079 |
| 0.6590277777777778 | 43.079 |
| 0.6597222222222222 | 38.653 |
| 0.6604166666666667 | 34.234 |
| 0.6611111111111111 | 29.823 |
| 0.6618055555555555 | 21.024 |
| 0.6625 | 21.024 |
| 0.6631944444444444 | 25.419 |
| 0.6638888888888889 | 29.823 |
| 0.6645833333333333 | 29.823 |
| 0.6652777777777777 | 29.823 |
| 0.6659722222222222 | 21.024 |
| 0.6666666666666666 | 25.419 |
| 0.6673611111111111 | 34.234 |
| 0.6680555555555556 | 38.653 |
| 0.6687500000000001 | 34.234 |
| 0.6694444444444444 | 34.234 |
| 0.6701388888888888 | 34.234 |
| 0.6708333333333334 | 34.234 |
| 0.6715277777777778 | 29.823 |
| 0.6722222222222222 | 25.419 |
| 0.6729166666666666 | 29.823 |
| 0.6736111111111112 | 25.419 |
| 0.6743055555555556 | 21.024 |
| 0.6749999999999999 | 12.257 |
| 0.6756944444444444 | 21.024 |
| 0.6763888888888889 | 29.823 |
| 0.6770833333333334 | 38.653 |
| 0.6777777777777777 | 38.653 |
| 0.6784722222222223 | 29.823 |
| 0.6791666666666667 | 29.823 |
| 0.6798611111111111 | 29.823 |
| 0.6805555555555555 | 34.234 |
| 0.68125 | 29.823 |
| 0.6819444444444445 | 21.024 |
| 0.6826388888888889 | 21.024 |
| 0.6833333333333332 | 16.636 |
| 0.6840277777777778 | 16.636 |
| 0.6847222222222222 | 16.636 |
| 0.6854166666666667 | 16.636 |
| 0.686111111111111 | 16.636 |
| 0.6868055555555556 | 16.636 |
| 0.6875 | 16.636 |
| 0.6881944444444444 | 21.024 |
| 0.688888888888889 | 25.419 |
| 0.6895833333333333 | 25.419 |
| 0.6902777777777778 | 29.823 |
| 0.6909722222222222 | 29.823 |
| 0.6916666666666668 | 29.823 |
| 0.6923611111111111 | 29.823 |
| 0.6930555555555555 | 29.823 |
| 0.69375 | 25.419 |
| 0.6944444444444445 | 25.419 |
| 0.6951388888888889 | 25.419 |
| 0.6958333333333333 | 29.823 |
| 0.6965277777777777 | 34.234 |
| 0.6972222222222223 | 38.653 |
| 0.6979166666666666 | 38.653 |
| 0.6986111111111111 | 43.079 |
| 0.6993055555555556 | 47.511 |
| 0.7000000000000001 | 43.079 |
| 0.7006944444444444 | 43.079 |
| 0.7013888888888888 | 38.653 |
| 0.7020833333333334 | 43.079 |
| 0.7027777777777778 | 43.079 |
| 0.7034722222222222 | 38.653 |
| 0.7041666666666666 | 38.653 |
| 0.7048611111111112 | 43.079 |
| 0.7055555555555556 | 47.511 |
| 0.7062499999999999 | 56.398 |
| 0.7069444444444444 | 56.398 |
| 0.7076388888888889 | 56.398 |
| 0.7083333333333334 | 51.951 |
| 0.7090277777777777 | 47.511 |
| 0.7097222222222223 | 47.511 |
| 0.7104166666666667 | 47.511 |
| 0.7111111111111111 | 51.951 |
| 0.7118055555555555 | 51.951 |
| 0.7125 | 51.951 |
| 0.7131944444444445 | 51.951 |
| 0.7138888888888889 | 56.398 |
| 0.7145833333333332 | 65.31 |
| 0.7152777777777778 | 74.246 |
| 0.7159722222222222 | 83.205 |
| 0.7166666666666667 | 83.205 |
| 0.717361111111111 | 92.184 |
| 0.7180555555555556 | 101.184 |
| 0.71875 | 119.235 |
| 0.7194444444444444 | 128.284 |
| 0.720138888888889 | 137.347 |
| 0.7208333333333333 | 137.347 |
| 0.7215277777777778 | 132.814 |
| 0.7222222222222222 | 128.284 |
| 0.7229166666666668 | 123.758 |
| 0.7236111111111111 | 128.284 |
| 0.7243055555555555 | 146.423 |
| 0.725 | 150.964 |
| 0.7256944444444445 | 141.884 |
| 0.7263888888888889 | 128.284 |
| 0.7270833333333333 | 110.201 |
| 0.7277777777777777 | 101.184 |
| 0.7284722222222223 | 92.184 |
| 0.7291666666666666 | 78.722 |
| 0.7298611111111111 | 69.775 |
| 0.7305555555555556 | 65.31 |
| 0.7312500000000001 | 65.31 |
| 0.7319444444444444 | 60.85 |
| 0.7326388888888888 | 56.398 |
| 0.7333333333333334 | 56.398 |
| 0.7340277777777778 | 60.85 |
| 0.7347222222222222 | 65.31 |
| 0.7354166666666666 | 78.722 |
| 0.7361111111111112 | 78.722 |
| 0.7368055555555556 | 74.246 |
| 0.7374999999999999 | 69.775 |
| 0.7381944444444444 | 78.722 |
| 0.7388888888888889 | 83.205 |
| 0.7395833333333334 | 74.246 |
| 0.7402777777777777 | 74.246 |
| 0.7409722222222223 | 69.775 |
| 0.7416666666666667 | 69.775 |
| 0.7423611111111111 | 69.775 |
| 0.7430555555555555 | 74.246 |
| 0.74375 | 74.246 |
| 0.7444444444444445 | 74.246 |
| 0.7451388888888889 | 65.31 |
| 0.7458333333333332 | 65.31 |
| 0.7465277777777778 | 56.398 |
| 0.7472222222222222 | 51.951 |
| 0.7479166666666667 | 47.511 |
| 0.748611111111111 | 47.511 |
| 0.7493055555555556 | 43.079 |
| 0.75 | 43.079 |
| 0.7506944444444444 | 43.079 |
| 0.751388888888889 | 43.079 |
| 0.7520833333333333 | 47.511 |
| 0.7527777777777778 | 43.079 |
| 0.7534722222222222 | 38.653 |
| 0.7541666666666668 | 38.653 |
| 0.7548611111111111 | 38.653 |
| 0.7555555555555555 | 38.653 |
| 0.75625 | 38.653 |
| 0.7569444444444445 | 34.234 |
| 0.7576388888888889 | 29.823 |
| 0.7583333333333333 | 34.234 |
| 0.7590277777777777 | 34.234 |
| 0.7597222222222223 | 29.823 |
| 0.7604166666666666 | 29.823 |
| 0.7611111111111111 | 29.823 |
| 0.7618055555555556 | 29.823 |
| 0.7625000000000001 | 34.234 |
| 0.7631944444444444 | 38.653 |
| 0.7638888888888888 | 38.653 |
| 0.7645833333333334 | 34.234 |
| 0.7652777777777778 | 29.823 |
| 0.7659722222222222 | 25.419 |
| 0.7666666666666666 | 25.419 |
| 0.7673611111111112 | 25.419 |
| 0.7680555555555556 | 21.024 |
| 0.7687499999999999 | 21.024 |
| 0.7694444444444444 | 16.636 |
| 0.7701388888888889 | 12.257 |
| 0.7708333333333334 | 12.257 |
| 0.7715277777777777 | 12.257 |
| 0.7722222222222223 | 12.257 |
| 0.7729166666666667 | 12.257 |
| 0.7736111111111111 | 12.257 |
| 0.7743055555555555 | 16.636 |
| 0.775 | 16.636 |
| 0.7756944444444445 | 12.257 |
| 0.7763888888888889 | 16.636 |
| 0.7770833333333332 | 21.024 |
| 0.7777777777777778 | 21.024 |
| 0.7784722222222222 | 21.024 |
| 0.7791666666666667 | 25.419 |
| 0.779861111111111 | 29.823 |
| 0.7805555555555556 | 29.823 |
| 0.78125 | 25.419 |
| 0.7819444444444444 | 21.024 |
| 0.782638888888889 | 25.419 |
| 0.7833333333333333 | 21.024 |
| 0.7840277777777778 | 21.024 |
| 0.7847222222222222 | 21.024 |
| 0.7854166666666668 | 29.823 |
| 0.7861111111111111 | 34.234 |
| 0.7868055555555555 | 43.079 |
| 0.7875 | 47.511 |
| 0.7881944444444445 | 38.653 |
| 0.7888888888888889 | 38.653 |
| 0.7895833333333333 | 34.234 |
| 0.7902777777777777 | 38.653 |
| 0.7909722222222223 | 38.653 |
| 0.7916666666666666 | 34.234 |
| 0.7923611111111111 | 34.234 |
| 0.7930555555555556 | 38.653 |
| 0.7937500000000001 | 38.653 |
| 0.7944444444444444 | 34.234 |
| 0.7951388888888888 | 29.823 |
| 0.7958333333333334 | 29.823 |
| 0.7965277777777778 | 25.419 |
| 0.7972222222222222 | 25.419 |
| 0.7979166666666666 | 21.024 |
| 0.7986111111111112 | 21.024 |
| 0.7993055555555556 | 12.257 |
| 0.7999999999999999 | 12.257 |
| 0.8006944444444444 | 12.257 |
| 0.8013888888888889 | 12.257 |
| 0.8020833333333334 | 7.887 |
| 0.8027777777777777 | 12.257 |
| 0.8034722222222223 | 7.887 |
| 0.8041666666666667 | 7.887 |
| 0.8048611111111111 | 7.887 |
| 0.8055555555555555 | 7.887 |
| 0.80625 | 7.887 |
| 0.8069444444444445 | 7.887 |
| 0.8076388888888889 | 7.887 |
| 0.8083333333333332 | 7.887 |
| 0.8090277777777778 | 7.887 |
| 0.8097222222222222 | 7.887 |
| 0.8104166666666667 | 7.887 |
| 0.811111111111111 | 3.525 |
| 0.8118055555555556 | 3.525 |
| 0.8125 | 3.525 |
| 0.8131944444444444 | 3.525 |
| 0.813888888888889 | 3.525 |
| 0.8145833333333333 | 3.525 |
| 0.8152777777777778 | 0 |
| 0.8159722222222222 | 0 |
| 0.8166666666666668 | 0 |
| 0.8173611111111111 | 0 |
| 0.8180555555555555 | 0 |
| 0.81875 | 0 |
| 0.8194444444444445 | 0 |
| 0.8201388888888889 | 0 |
| 0.8208333333333333 | 0 |
| 0.8215277777777777 | 0 |
| 0.8222222222222223 | 0 |
| 0.8229166666666666 | 0 |
| 0.8236111111111111 | 0 |
| 0.8243055555555556 | 0 |
| 0.8250000000000001 | 0 |
| 0.8256944444444444 | 0 |
| 0.8263888888888888 | 0 |
| 0.8270833333333334 | 0 |
| 0.8277777777777778 | 0 |
| 0.8284722222222222 | 0 |
| 0.8291666666666666 | 0 |
| 0.8298611111111112 | 0 |
| 0.8305555555555556 | 0 |
| 0.8312499999999999 | 0 |
| 0.8319444444444444 | 0 |
| 0.8326388888888889 | 0 |
| 0.8333333333333334 | 0 |
| 0.8340277777777777 | 0 |
| 0.8347222222222223 | 0 |
| 0.8354166666666667 | 0 |
| 0.8361111111111111 | 0 |
| 0.8368055555555555 | 0 |
| 0.8375 | 0 |
| 0.8381944444444445 | 0 |
| 0.8388888888888889 | 0 |
| 0.8395833333333332 | 0 |
| 0.8402777777777778 | 0 |
| 0.8409722222222222 | 0 |
| 0.8416666666666667 | 0 |
| 0.842361111111111 | 0 |
| 0.8430555555555556 | 0 |
| 0.84375 | 0 |
| 0.8444444444444444 | 0 |
| 0.845138888888889 | 0 |
| 0.8458333333333333 | 0 |
| 0.8465277777777778 | 0 |
| 0.8472222222222222 | 0 |
| 0.8479166666666668 | 0 |
| 0.8486111111111111 | 0 |
| 0.8493055555555555 | 0 |
| 0.85 | 0 |
| 0.8506944444444445 | 0 |
| 0.8513888888888889 | 0 |
| 0.8520833333333333 | 0 |
| 0.8527777777777777 | 0 |
| 0.8534722222222223 | 0 |
| 0.8541666666666666 | 0 |
| 0.8548611111111111 | 0 |
| 0.8555555555555556 | 0 |
| 0.8562500000000001 | 0 |
| 0.8569444444444444 | 0 |
| 0.8576388888888888 | 0 |
| 0.8583333333333334 | 0 |
| 0.8590277777777778 | 0 |
| 0.8597222222222222 | 0 |
| 0.8604166666666666 | 0 |
| 0.8611111111111112 | 0 |
| 0.8618055555555556 | 0 |
| 0.8624999999999999 | 0 |
| 0.8631944444444444 | 0 |
| 0.8638888888888889 | 0 |
| 0.8645833333333334 | 0 |
| 0.8652777777777777 | 0 |
| 0.8659722222222223 | 0 |
| 0.8666666666666667 | 0 |
| 0.8673611111111111 | 0 |
| 0.8680555555555555 | 0 |
| 0.86875 | 0 |
| 0.8694444444444445 | 0 |
| 0.8701388888888889 | 0 |
| 0.8708333333333332 | 0 |
| 0.8715277777777778 | 0 |
| 0.8722222222222222 | 0 |
| 0.8729166666666667 | 0 |
| 0.873611111111111 | 0 |
| 0.8743055555555556 | 0 |
| 0.875 | 0 |
| 0.8756944444444444 | 0 |
| 0.876388888888889 | 0 |
| 0.8770833333333333 | 0 |
| 0.8777777777777778 | 0 |
| 0.8784722222222222 | 0 |
| 0.8791666666666668 | 0 |
| 0.8798611111111111 | 0 |
| 0.8805555555555555 | 0 |
| 0.88125 | 0 |
| 0.8819444444444445 | 0 |
| 0.8826388888888889 | 0 |
| 0.8833333333333333 | 0 |
| 0.8840277777777777 | 0 |
| 0.8847222222222223 | 0 |
| 0.8854166666666666 | 0 |
| 0.8861111111111111 | 0 |
| 0.8868055555555556 | 0 |
| 0.8875000000000001 | 0 |
| 0.8881944444444444 | 0 |
| 0.8888888888888888 | 0 |
| 0.8895833333333334 | 0 |
| 0.8902777777777778 | 0 |
| 0.8909722222222222 | 0 |
| 0.8916666666666666 | 0 |
| 0.8923611111111112 | 0 |
| 0.8930555555555556 | 0 |
| 0.8937499999999999 | 0 |
| 0.8944444444444444 | 0 |
| 0.8951388888888889 | 0 |
| 0.8958333333333334 | 0 |
| 0.8965277777777777 | 0 |
| 0.8972222222222223 | 0 |
| 0.8979166666666667 | 0 |
| 0.8986111111111111 | 0 |
| 0.8993055555555555 | 0 |
| 0.9 | 0 |
| 0.9006944444444445 | 0 |
| 0.9013888888888889 | 0 |
| 0.9020833333333332 | 0 |
| 0.9027777777777778 | 0 |
| 0.9034722222222222 | 0 |
| 0.9041666666666667 | 0 |
| 0.904861111111111 | 0 |
| 0.9055555555555556 | 0 |
| 0.90625 | 0 |
| 0.9069444444444444 | 0 |
| 0.907638888888889 | 0 |
| 0.9083333333333333 | 0 |
| 0.9090277777777778 | 0 |
| 0.9097222222222222 | 0 |
| 0.9104166666666668 | 0 |
| 0.9111111111111111 | 0 |
| 0.9118055555555555 | 0 |
| 0.9125 | 0 |
| 0.9131944444444445 | 0 |
| 0.9138888888888889 | 0 |
| 0.9145833333333333 | 0 |
| 0.9152777777777777 | 0 |
| 0.9159722222222223 | 0 |
| 0.9166666666666666 | 0 |
| 0.9173611111111111 | 0 |
| 0.9180555555555556 | 0 |
| 0.9187500000000001 | 0 |
| 0.9194444444444444 | 0 |
| 0.9201388888888888 | 0 |
| 0.9208333333333334 | 0 |
| 0.9215277777777778 | 0 |
| 0.9222222222222222 | 0 |
| 0.9229166666666666 | 0 |
| 0.9236111111111112 | 0 |
| 0.9243055555555556 | 0 |
| 0.9249999999999999 | 0 |
| 0.9256944444444444 | 0 |
| 0.9263888888888889 | 0 |
| 0.9270833333333334 | 0 |
| 0.9277777777777777 | 0 |
| 0.9284722222222223 | 0 |
| 0.9291666666666667 | 0 |
| 0.9298611111111111 | 0 |
| 0.9305555555555555 | 0 |
| 0.93125 | 0 |
| 0.9319444444444445 | 0 |
| 0.9326388888888889 | 0 |
| 0.9333333333333332 | 0 |
| 0.9340277777777778 | 0 |
| 0.9347222222222222 | 0 |
| 0.9354166666666667 | 0 |
| 0.936111111111111 | 0 |
| 0.9368055555555556 | 0 |
| 0.9375 | 0 |
| 0.9381944444444444 | 0 |
| 0.938888888888889 | 0 |
| 0.9395833333333333 | 0 |
| 0.9402777777777778 | 0 |
| 0.9409722222222222 | 0 |
| 0.9416666666666668 | 0 |
| 0.9423611111111111 | 0 |
| 0.9430555555555555 | 0 |
| 0.94375 | 0 |
| 0.9444444444444445 | 0 |
| 0.9451388888888889 | 0 |
| 0.9458333333333333 | 0 |
| 0.9465277777777777 | 0 |
| 0.9472222222222223 | 0 |
| 0.9479166666666666 | 0 |
| 0.9486111111111111 | 0 |
| 0.9493055555555556 | 0 |
| 0.9500000000000001 | 0 |
| 0.9506944444444444 | 0 |
| 0.9513888888888888 | 0 |
| 0.9520833333333334 | 0 |
| 0.9527777777777778 | 0 |
| 0.9534722222222222 | 0 |
| 0.9541666666666666 | 0 |
| 0.9548611111111112 | 0 |
| 0.9555555555555556 | 0 |
| 0.9562499999999999 | 0 |
| 0.9569444444444444 | 0 |
| 0.9576388888888889 | 0 |
| 0.9583333333333334 | 0 |
| 0.9590277777777777 | 0 |
| 0.9597222222222223 | 0 |
| 0.9604166666666667 | 0 |
| 0.9611111111111111 | 0 |
| 0.9618055555555555 | 0 |
| 0.9625 | 0 |
| 0.9631944444444445 | 0 |
| 0.9638888888888889 | 0 |
| 0.9645833333333332 | 0 |
| 0.9652777777777778 | 0 |
| 0.9659722222222222 | 0 |
| 0.9666666666666667 | 0 |
| 0.967361111111111 | 0 |
| 0.9680555555555556 | 0 |
| 0.96875 | 0 |
| 0.9694444444444444 | 0 |
| 0.970138888888889 | 0 |
| 0.9708333333333333 | 0 |
| 0.9715277777777778 | 0 |
| 0.9722222222222222 | 0 |
| 0.9729166666666668 | 0 |
| 0.9736111111111111 | 0 |
| 0.9743055555555555 | 0 |
| 0.975 | 0 |
| 0.9756944444444445 | 0 |
| 0.9763888888888889 | 0 |
| 0.9770833333333333 | 0 |
| 0.9777777777777777 | 0 |
| 0.9784722222222223 | 0 |
| 0.9791666666666666 | 0 |
| 0.9798611111111111 | 0 |
| 0.9805555555555556 | 0 |
| 0.9812500000000001 | 0 |
| 0.9819444444444444 | 0 |
| 0.9826388888888888 | 0 |
| 0.9833333333333334 | 0 |
| 0.9840277777777778 | 0 |
| 0.9847222222222222 | 0 |
| 0.9854166666666666 | 0 |
| 0.9861111111111112 | 0 |
| 0.9868055555555556 | 0 |
| 0.9874999999999999 | 0 |
| 0.9881944444444444 | 0 |
| 0.9888888888888889 | 0 |
| 0.9895833333333334 | 0 |
| 0.9902777777777777 | 0 |
| 0.9909722222222223 | 0 |
| 0.9916666666666667 | 0 |
| 0.9923611111111111 | 0 |
| 0.9930555555555555 | 0 |
| 0.99375 | 0 |
| 0.9944444444444445 | 0 |
| 0.9951388888888889 | 0 |
| 0.9958333333333332 | 0 |
| 0.9965277777777778 | 0 |
| 0.9972222222222222 | 0 |
| 0.9979166666666667 | 0 |
| 0.998611111111111 | 0 |
| 0.9993055555555556 | 0 |